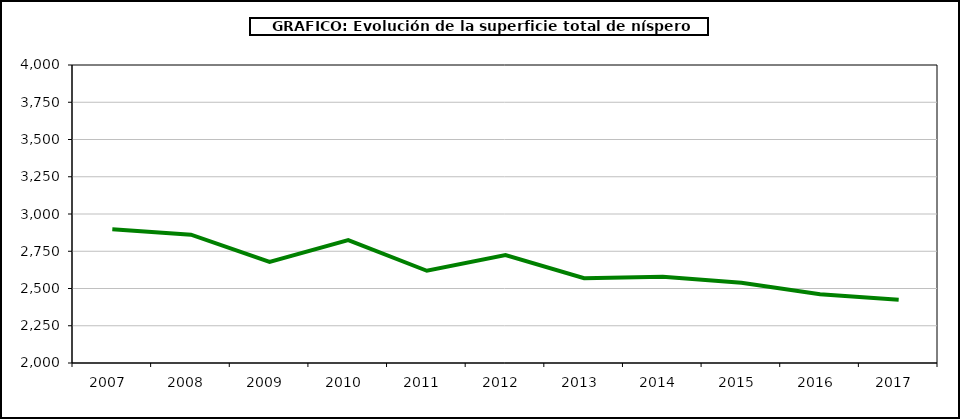
| Category | superficie níspero |
|---|---|
| 2007.0 | 2897 |
| 2008.0 | 2861 |
| 2009.0 | 2679 |
| 2010.0 | 2825 |
| 2011.0 | 2619 |
| 2012.0 | 2724 |
| 2013.0 | 2569 |
| 2014.0 | 2579 |
| 2015.0 | 2539 |
| 2016.0 | 2461 |
| 2017.0 | 2425 |